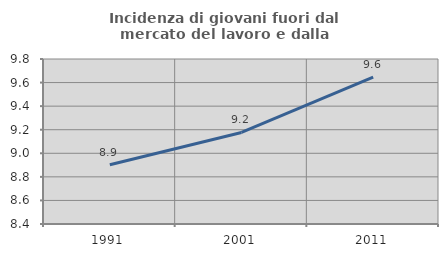
| Category | Incidenza di giovani fuori dal mercato del lavoro e dalla formazione  |
|---|---|
| 1991.0 | 8.903 |
| 2001.0 | 9.176 |
| 2011.0 | 9.646 |